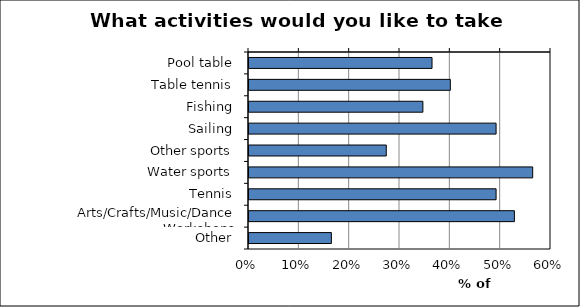
| Category | Series 0 |
|---|---|
| Pool table | 0.364 |
| Table tennis | 0.4 |
| Fishing | 0.345 |
| Sailing | 0.491 |
| Other sports | 0.273 |
| Water sports | 0.564 |
| Tennis | 0.491 |
| Arts/Crafts/Music/Dance Workshops | 0.527 |
| Other | 0.164 |